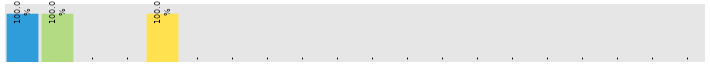
| Category | Wednesday |
|---|---|
| Accounts | 1 |
| HR | 1 |
| Lobby/Reception | 0 |
| Administration | 0 |
| Customer Support | 1 |
| Finance | 0 |
| Human Resources | 0 |
| IT | 0 |
| Marketing | 0 |
| R&D | 0 |
| Sales | 0 |